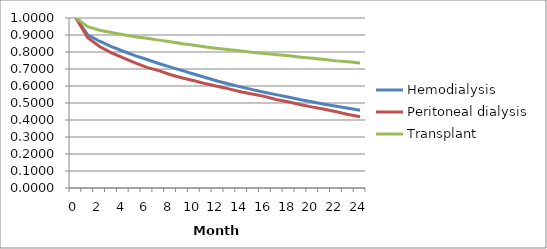
| Category | Hemodialysis | Peritoneal dialysis | Transplant |
|---|---|---|---|
| 0.0 | 1 | 1 | 1 |
| 1.0 | 0.9 | 0.884 | 0.949 |
| 2.0 | 0.863 | 0.833 | 0.928 |
| 3.0 | 0.832 | 0.795 | 0.915 |
| 4.0 | 0.804 | 0.765 | 0.902 |
| 5.0 | 0.779 | 0.736 | 0.89 |
| 6.0 | 0.756 | 0.71 | 0.881 |
| 7.0 | 0.733 | 0.69 | 0.87 |
| 8.0 | 0.711 | 0.666 | 0.861 |
| 9.0 | 0.69 | 0.647 | 0.849 |
| 10.0 | 0.669 | 0.631 | 0.84 |
| 11.0 | 0.648 | 0.613 | 0.829 |
| 12.0 | 0.628 | 0.597 | 0.821 |
| 13.0 | 0.611 | 0.582 | 0.813 |
| 14.0 | 0.593 | 0.564 | 0.806 |
| 15.0 | 0.577 | 0.551 | 0.798 |
| 16.0 | 0.561 | 0.538 | 0.791 |
| 17.0 | 0.548 | 0.519 | 0.784 |
| 18.0 | 0.534 | 0.506 | 0.777 |
| 19.0 | 0.519 | 0.49 | 0.77 |
| 20.0 | 0.506 | 0.476 | 0.764 |
| 21.0 | 0.493 | 0.463 | 0.756 |
| 22.0 | 0.481 | 0.448 | 0.748 |
| 23.0 | 0.469 | 0.432 | 0.743 |
| 24.0 | 0.457 | 0.419 | 0.735 |